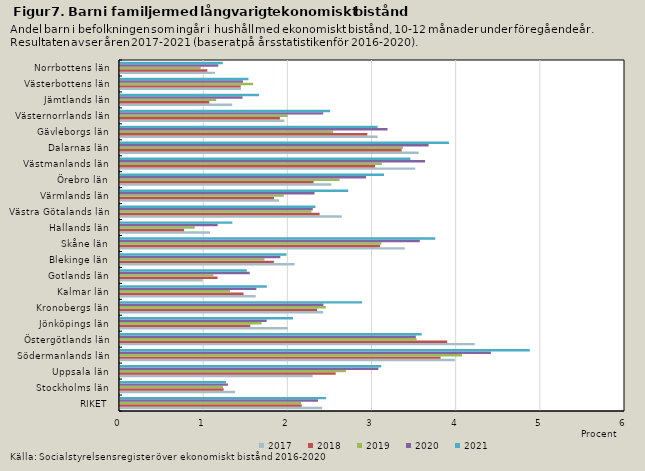
| Category | 2017 | 2018 | 2019 | 2020 | 2021 |
|---|---|---|---|---|---|
| RIKET | 2.4 | 2.158 | 2.152 | 2.353 | 2.449 |
| Stockholms län | 1.367 | 1.231 | 1.224 | 1.283 | 1.259 |
| Uppsala län | 2.29 | 2.563 | 2.683 | 3.069 | 3.103 |
| Södermanlands län | 3.978 | 3.809 | 4.063 | 4.407 | 4.869 |
| Östergötlands län | 4.215 | 3.887 | 3.523 | 3.515 | 3.584 |
| Jönköpings län | 1.993 | 1.548 | 1.682 | 1.743 | 2.056 |
| Kronobergs län | 2.415 | 2.342 | 2.446 | 2.417 | 2.877 |
| Kalmar län | 1.613 | 1.468 | 1.307 | 1.62 | 1.744 |
| Gotlands län | 0.982 | 1.159 | 1.109 | 1.541 | 1.507 |
| Blekinge län | 2.075 | 1.828 | 1.716 | 1.905 | 1.979 |
| Skåne län | 3.384 | 3.09 | 3.105 | 3.562 | 3.746 |
| Hallands län | 1.07 | 0.761 | 0.888 | 1.16 | 1.335 |
| Västra Götalands län | 2.636 | 2.372 | 2.275 | 2.291 | 2.323 |
| Värmlands län | 1.889 | 1.828 | 1.946 | 2.312 | 2.712 |
| Örebro län | 2.511 | 2.3 | 2.609 | 2.924 | 3.137 |
| Västmanlands län | 3.508 | 3.03 | 3.111 | 3.624 | 3.45 |
| Dalarnas län | 3.549 | 3.346 | 3.36 | 3.667 | 3.909 |
| Gävleborgs län | 3.061 | 2.938 | 2.532 | 3.179 | 3.06 |
| Västernorrlands län | 1.954 | 1.9 | 1.991 | 2.414 | 2.496 |
| Jämtlands län | 1.333 | 1.061 | 1.143 | 1.455 | 1.651 |
| Västerbottens län | 1.437 | 1.434 | 1.581 | 1.46 | 1.526 |
| Norrbottens län | 1.128 | 1.037 | 0.959 | 1.168 | 1.221 |